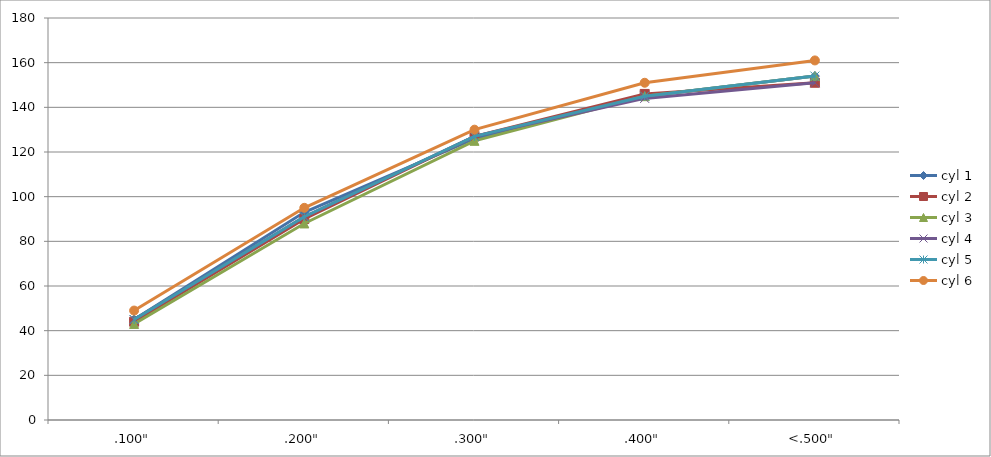
| Category | cyl 1 | cyl 2 | cyl 3 | cyl 4 | cyl 5 | cyl 6 |
|---|---|---|---|---|---|---|
| .100" | 45 | 44 | 43 | 45 | 45 | 49 |
| .200" | 93 | 90 | 88 | 91 | 91 | 95 |
| .300" | 126 | 127 | 125 | 127 | 127 | 130 |
| .400" | 145 | 146 | 145 | 144 | 145 | 151 |
| <.500" | 154 | 151 | 154 | 151 | 154 | 161 |